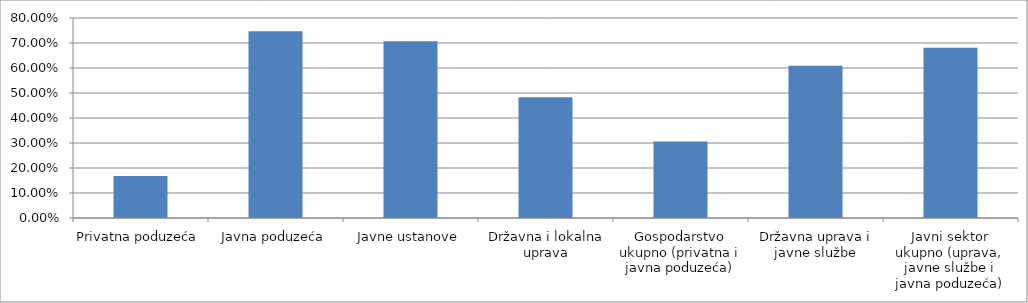
| Category | Series 0 |
|---|---|
| Privatna poduzeća | 0.168 |
| Javna poduzeća | 0.747 |
| Javne ustanove | 0.707 |
| Državna i lokalna uprava | 0.483 |
| Gospodarstvo ukupno (privatna i javna poduzeća) | 0.306 |
| Državna uprava i javne službe | 0.609 |
| Javni sektor ukupno (uprava, javne službe i javna poduzeća) | 0.681 |